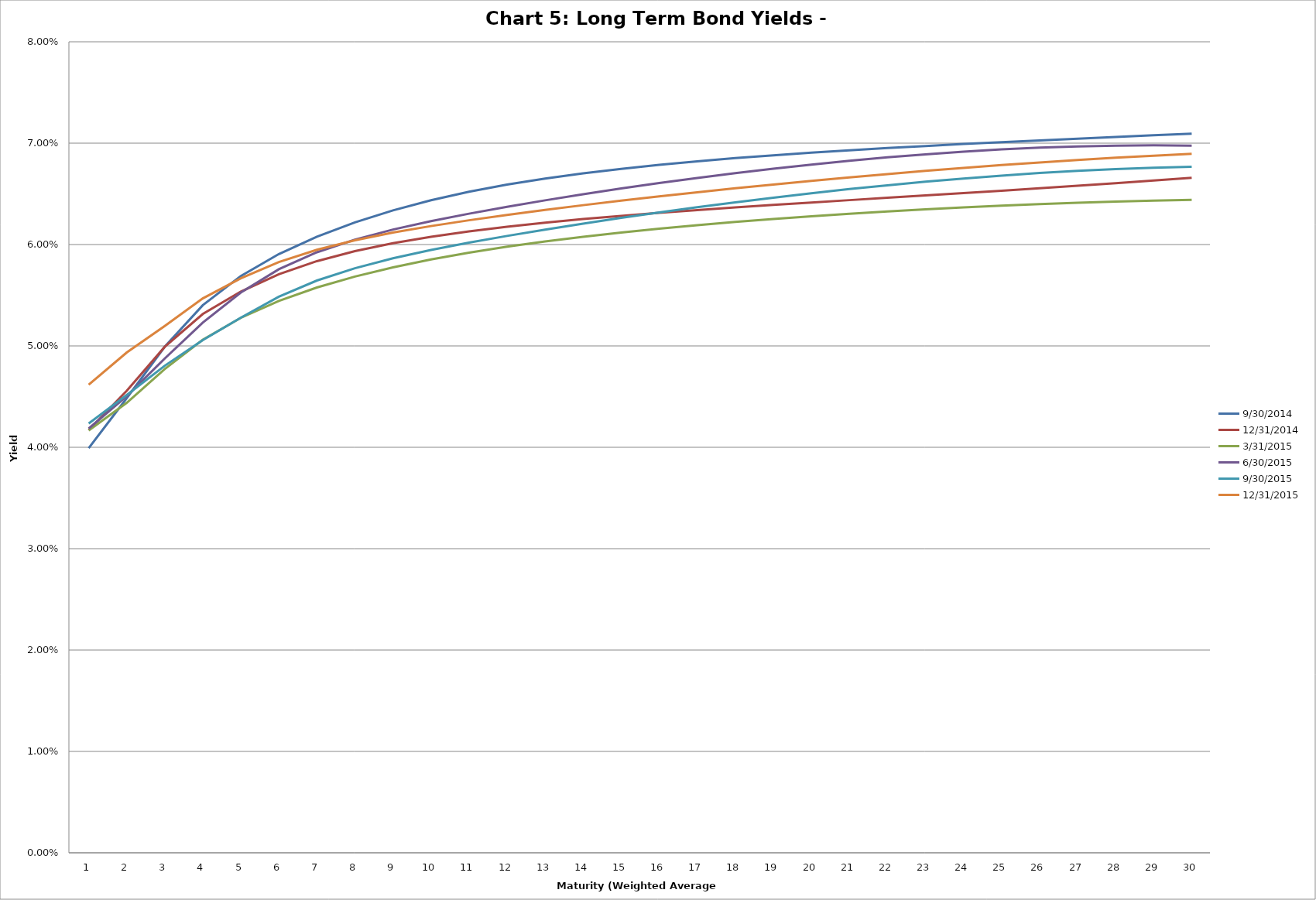
| Category | 9/30/2014 | 12/31/2014 | 3/31/2015 | 6/30/2015 | 9/30/2015 | 12/31/2015 |
|---|---|---|---|---|---|---|
| 0 | 0.04 | 0.042 | 0.042 | 0.042 | 0.042 | 0.046 |
| 1 | 0.045 | 0.046 | 0.044 | 0.045 | 0.045 | 0.049 |
| 2 | 0.05 | 0.05 | 0.048 | 0.049 | 0.048 | 0.052 |
| 3 | 0.054 | 0.053 | 0.051 | 0.052 | 0.051 | 0.055 |
| 4 | 0.057 | 0.055 | 0.053 | 0.055 | 0.053 | 0.057 |
| 5 | 0.059 | 0.057 | 0.054 | 0.058 | 0.055 | 0.058 |
| 6 | 0.061 | 0.058 | 0.056 | 0.059 | 0.056 | 0.059 |
| 7 | 0.062 | 0.059 | 0.057 | 0.06 | 0.058 | 0.06 |
| 8 | 0.063 | 0.06 | 0.058 | 0.061 | 0.059 | 0.061 |
| 9 | 0.064 | 0.061 | 0.059 | 0.062 | 0.059 | 0.062 |
| 10 | 0.065 | 0.061 | 0.059 | 0.063 | 0.06 | 0.062 |
| 11 | 0.066 | 0.062 | 0.06 | 0.064 | 0.061 | 0.063 |
| 12 | 0.067 | 0.062 | 0.06 | 0.064 | 0.061 | 0.063 |
| 13 | 0.067 | 0.063 | 0.061 | 0.065 | 0.062 | 0.064 |
| 14 | 0.067 | 0.063 | 0.061 | 0.066 | 0.063 | 0.064 |
| 15 | 0.068 | 0.063 | 0.062 | 0.066 | 0.063 | 0.065 |
| 16 | 0.068 | 0.063 | 0.062 | 0.067 | 0.064 | 0.065 |
| 17 | 0.069 | 0.064 | 0.062 | 0.067 | 0.064 | 0.066 |
| 18 | 0.069 | 0.064 | 0.063 | 0.067 | 0.065 | 0.066 |
| 19 | 0.069 | 0.064 | 0.063 | 0.068 | 0.065 | 0.066 |
| 20 | 0.069 | 0.064 | 0.063 | 0.068 | 0.065 | 0.067 |
| 21 | 0.07 | 0.065 | 0.063 | 0.069 | 0.066 | 0.067 |
| 22 | 0.07 | 0.065 | 0.063 | 0.069 | 0.066 | 0.067 |
| 23 | 0.07 | 0.065 | 0.064 | 0.069 | 0.067 | 0.068 |
| 24 | 0.07 | 0.065 | 0.064 | 0.069 | 0.067 | 0.068 |
| 25 | 0.07 | 0.066 | 0.064 | 0.07 | 0.067 | 0.068 |
| 26 | 0.07 | 0.066 | 0.064 | 0.07 | 0.067 | 0.068 |
| 27 | 0.071 | 0.066 | 0.064 | 0.07 | 0.067 | 0.069 |
| 28 | 0.071 | 0.066 | 0.064 | 0.07 | 0.068 | 0.069 |
| 29 | 0.071 | 0.067 | 0.064 | 0.07 | 0.068 | 0.069 |